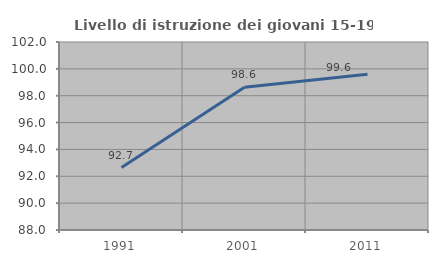
| Category | Livello di istruzione dei giovani 15-19 anni |
|---|---|
| 1991.0 | 92.652 |
| 2001.0 | 98.625 |
| 2011.0 | 99.59 |